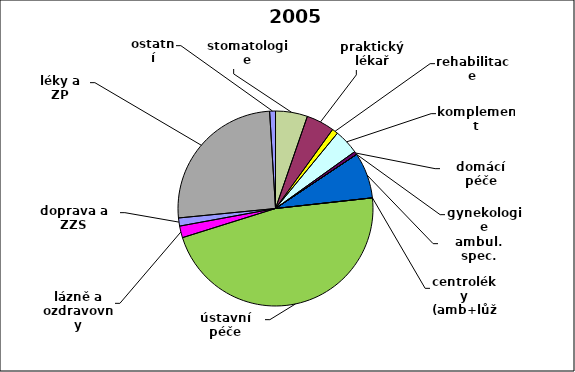
| Category | Series 0 |
|---|---|
| stomatologie | 0.053 |
| praktický lékař | 0.047 |
| rehabilitace | 0.01 |
| komplement | 0.041 |
| domácí péče | 0.006 |
| gynekologie | 0 |
| ambul. spec. | 0.076 |
| centroléky (amb+lůž) | 0 |
| ústavní péče | 0.469 |
| lázně a ozdravovny | 0.019 |
| doprava a ZZS | 0.013 |
| léky a ZP | 0.256 |
| ostatní | 0.01 |